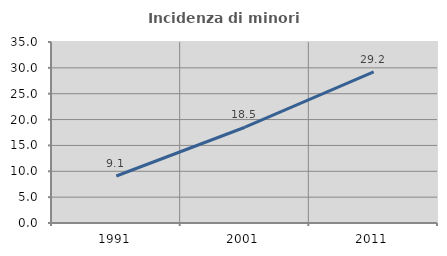
| Category | Incidenza di minori stranieri |
|---|---|
| 1991.0 | 9.091 |
| 2001.0 | 18.519 |
| 2011.0 | 29.245 |